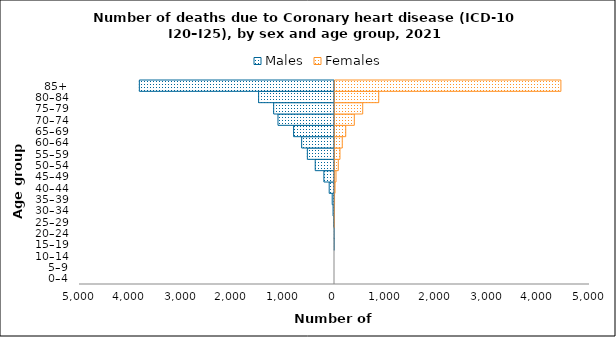
| Category | Males | Females |
|---|---|---|
| 0–4 | 0 | 0 |
| 5–9 | 0 | 0 |
| 10–14 | 0 | 0 |
| 15–19 | -1 | 0 |
| 20–24 | -2 | 0 |
| 25–29 | -12 | 3 |
| 30–34 | -28 | 7 |
| 35–39 | -45 | 11 |
| 40–44 | -104 | 20 |
| 45–49 | -208 | 39 |
| 50–54 | -378 | 84 |
| 55–59 | -532 | 117 |
| 60–64 | -644 | 162 |
| 65–69 | -802 | 230 |
| 70–74 | -1108 | 398 |
| 75–79 | -1193 | 563 |
| 80–84 | -1488 | 877 |
| 85+ | -3826 | 4449 |